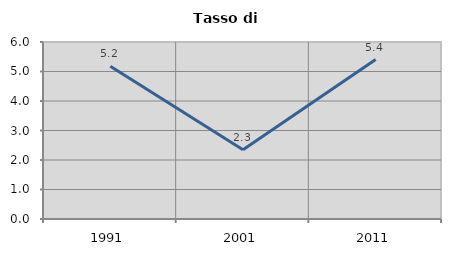
| Category | Tasso di disoccupazione   |
|---|---|
| 1991.0 | 5.176 |
| 2001.0 | 2.347 |
| 2011.0 | 5.405 |